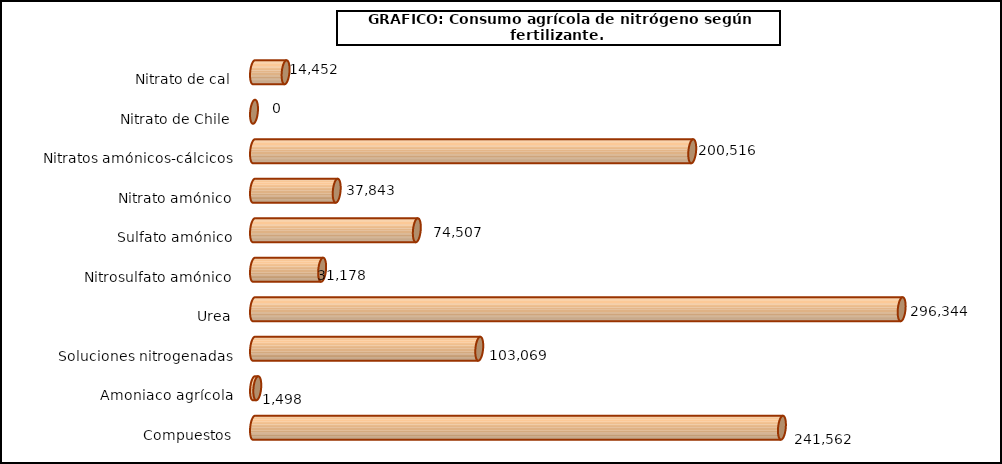
| Category | fert. N |
|---|---|
| 0 | 14452 |
| 1 | 0 |
| 2 | 200516 |
| 3 | 37843 |
| 4 | 74507 |
| 5 | 31178 |
| 6 | 296344 |
| 7 | 103069 |
| 8 | 1498 |
| 9 | 241562 |